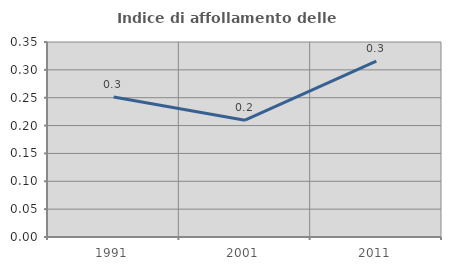
| Category | Indice di affollamento delle abitazioni  |
|---|---|
| 1991.0 | 0.251 |
| 2001.0 | 0.21 |
| 2011.0 | 0.316 |